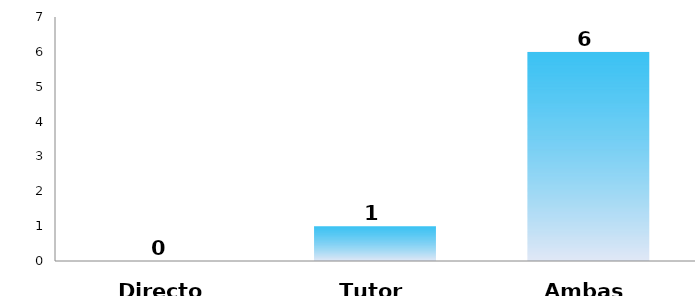
| Category | Series 0 |
|---|---|
| Director | 0 |
| Tutor | 1 |
| Ambas | 6 |